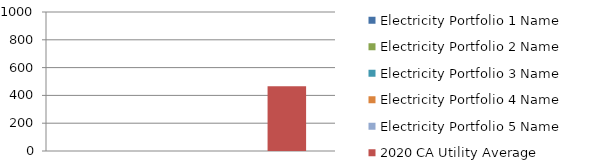
| Category | Electricity Portfolio 1 Name | Electricity Portfolio 2 Name | Electricity Portfolio 3 Name | Electricity Portfolio 4 Name | Electricity Portfolio 5 Name | 2020 CA Utility Average |
|---|---|---|---|---|---|---|
| 0 | 0 | 0 | 0 | 0 | 0 | 466 |